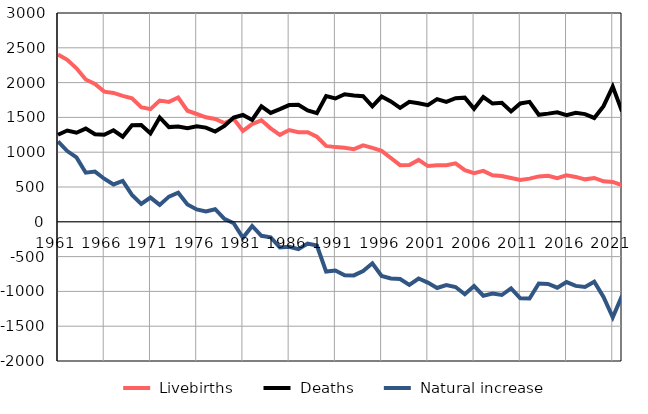
| Category |  Livebirths |  Deaths |  Natural increase |
|---|---|---|---|
| 1961.0 | 2405 | 1251 | 1154 |
| 1962.0 | 2328 | 1312 | 1016 |
| 1963.0 | 2205 | 1280 | 925 |
| 1964.0 | 2045 | 1339 | 706 |
| 1965.0 | 1979 | 1258 | 721 |
| 1966.0 | 1870 | 1251 | 619 |
| 1967.0 | 1852 | 1315 | 537 |
| 1968.0 | 1810 | 1222 | 588 |
| 1969.0 | 1774 | 1387 | 387 |
| 1970.0 | 1647 | 1391 | 256 |
| 1971.0 | 1618 | 1270 | 348 |
| 1972.0 | 1742 | 1499 | 243 |
| 1973.0 | 1723 | 1361 | 362 |
| 1974.0 | 1786 | 1369 | 417 |
| 1975.0 | 1596 | 1346 | 250 |
| 1976.0 | 1549 | 1371 | 178 |
| 1977.0 | 1501 | 1353 | 148 |
| 1978.0 | 1478 | 1297 | 181 |
| 1979.0 | 1420 | 1377 | 43 |
| 1980.0 | 1479 | 1499 | -20 |
| 1981.0 | 1306 | 1535 | -229 |
| 1982.0 | 1404 | 1464 | -60 |
| 1983.0 | 1458 | 1659 | -201 |
| 1984.0 | 1343 | 1565 | -222 |
| 1985.0 | 1250 | 1619 | -369 |
| 1986.0 | 1318 | 1677 | -359 |
| 1987.0 | 1288 | 1682 | -394 |
| 1988.0 | 1287 | 1601 | -314 |
| 1989.0 | 1222 | 1562 | -340 |
| 1990.0 | 1091 | 1806 | -715 |
| 1991.0 | 1073 | 1772 | -699 |
| 1992.0 | 1064 | 1833 | -769 |
| 1993.0 | 1044 | 1814 | -770 |
| 1994.0 | 1098 | 1804 | -706 |
| 1995.0 | 1062 | 1658 | -596 |
| 1996.0 | 1020 | 1799 | -779 |
| 1997.0 | 916 | 1730 | -814 |
| 1998.0 | 814 | 1637 | -823 |
| 1999.0 | 816 | 1723 | -907 |
| 2000.0 | 889 | 1704 | -815 |
| 2001.0 | 801 | 1675 | -874 |
| 2002.0 | 812 | 1763 | -951 |
| 2003.0 | 814 | 1722 | -908 |
| 2004.0 | 839 | 1776 | -937 |
| 2005.0 | 743 | 1784 | -1041 |
| 2006.0 | 700 | 1623 | -923 |
| 2007.0 | 731 | 1793 | -1062 |
| 2008.0 | 668 | 1699 | -1031 |
| 2009.0 | 658 | 1710 | -1052 |
| 2010.0 | 630 | 1586 | -956 |
| 2011.0 | 601 | 1701 | -1100 |
| 2012.0 | 620 | 1723 | -1103 |
| 2013.0 | 652 | 1538 | -886 |
| 2014.0 | 661 | 1554 | -893 |
| 2015.0 | 627 | 1574 | -947 |
| 2016.0 | 667 | 1533 | -866 |
| 2017.0 | 645 | 1566 | -921 |
| 2018.0 | 610 | 1547 | -937 |
| 2019.0 | 630 | 1492 | -862 |
| 2020.0 | 582 | 1662 | -1080 |
| 2021.0 | 572 | 1943 | -1371 |
| 2022.0 | 524 | 1587 | -1063 |